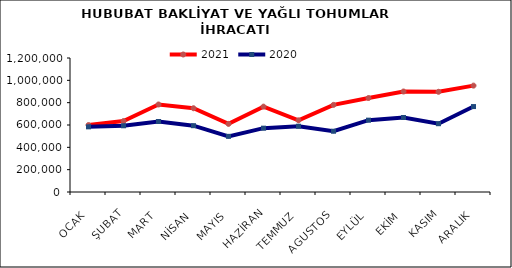
| Category | 2021 | 2020 |
|---|---|---|
| OCAK | 599472.627 | 583479.09 |
| ŞUBAT | 635173.32 | 593047.141 |
| MART | 783752.092 | 631314.894 |
| NİSAN | 750044.044 | 593842.386 |
| MAYIS | 609772.006 | 498426.752 |
| HAZİRAN | 764442.437 | 571551.143 |
| TEMMUZ | 641911.296 | 588897.205 |
| AGUSTOS | 780220.482 | 544244.333 |
| EYLÜL | 841689.582 | 643333.207 |
| EKİM | 899951.703 | 667002.416 |
| KASIM | 897392.075 | 611590.966 |
| ARALIK | 952702.427 | 765121.468 |